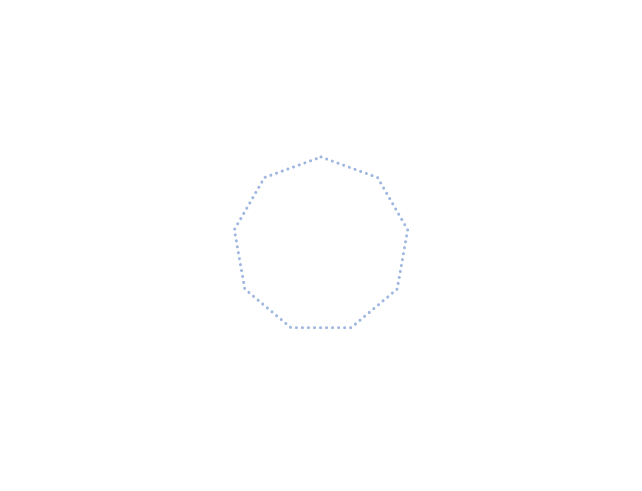
| Category | Series 0 | Attendus année 1 |
|---|---|---|
| Compétences/connaissances | 0 | 2 |
| Ressources internes/externes | 0 | 2 |
| Organiser planifier | 0 | 2 |
| Suivre avancées/progrès | 0 | 2 |
| Environnement, collectif de travail | 0 | 2 |
| Responsabilités, initiatives | 0 | 2 |
| S'adapter, remédier aux difficultés | 0 | 2 |
| Rendre compte de l'avancement | 0 | 2 |
| Analyser/évaluer son travail personnel | 0 | 2 |